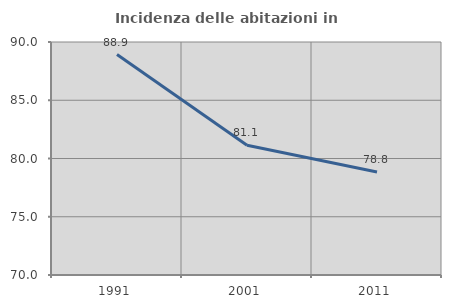
| Category | Incidenza delle abitazioni in proprietà  |
|---|---|
| 1991.0 | 88.926 |
| 2001.0 | 81.145 |
| 2011.0 | 78.838 |